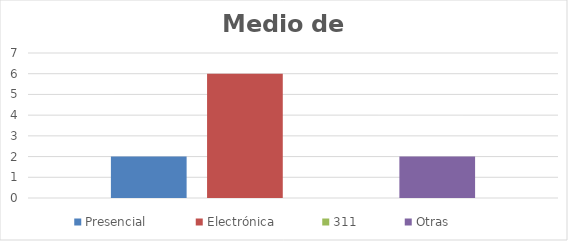
| Category | Presencial | Electrónica | 311 | Otras |
|---|---|---|---|---|
| 0 | 2 | 6 | 0 | 2 |